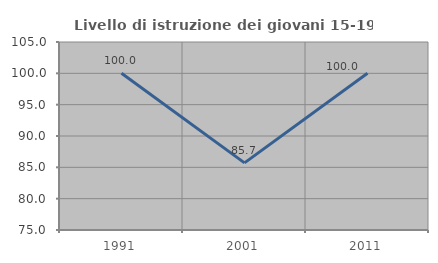
| Category | Livello di istruzione dei giovani 15-19 anni |
|---|---|
| 1991.0 | 100 |
| 2001.0 | 85.714 |
| 2011.0 | 100 |